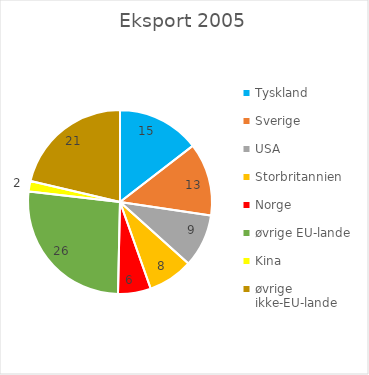
| Category | Eksport 2005 |
|---|---|
| Tyskland | 14.536 |
| Sverige | 12.826 |
| USA | 9.29 |
| Storbritannien | 7.928 |
| Norge | 5.769 |
| øvrige EU-lande | 26.489 |
| Kina | 1.83 |
| øvrige ikke-EU-lande | 21.332 |